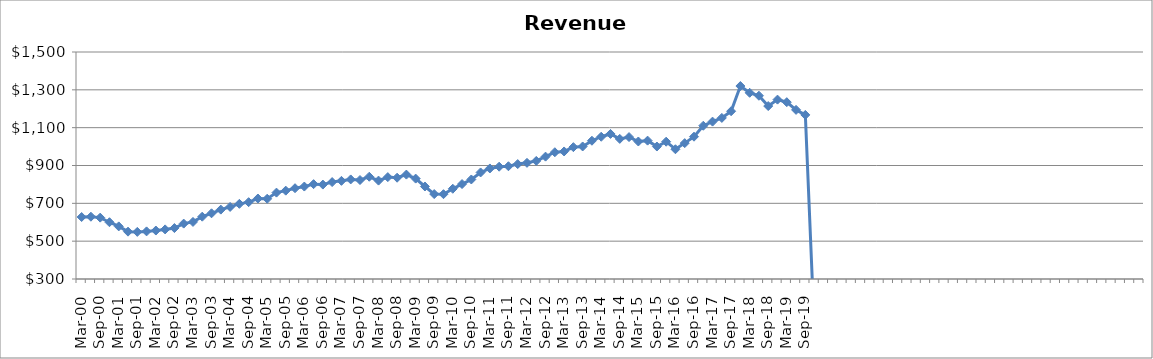
| Category | Revenue ($Millions) |
|---|---|
| Mar-00 | 627.657 |
| Jun-00 | 629.272 |
| Sep-00 | 624.434 |
| Dec-00 | 600.161 |
| Mar-01 | 578.053 |
| Jun-01 | 550.348 |
| Sep-01 | 549.084 |
| Dec-01 | 551.727 |
| Mar-02 | 556.207 |
| Jun-02 | 562.206 |
| Sep-02 | 569.278 |
| Dec-02 | 592.826 |
| Mar-03 | 601.708 |
| Jun-03 | 629.437 |
| Sep-03 | 647.333 |
| Dec-03 | 666.794 |
| Mar-04 | 681.084 |
| Jun-04 | 697.326 |
| Sep-04 | 706.206 |
| Dec-04 | 725.495 |
| Mar-05 | 724.118 |
| Jun-05 | 756.64 |
| Sep-05 | 766.982 |
| Dec-05 | 779.963 |
| Mar-06 | 788.662 |
| Jun-06 | 801.459 |
| Sep-06 | 799.132 |
| Dec-06 | 812.375 |
| Mar-07 | 818.81 |
| Jun-07 | 826.345 |
| Sep-07 | 823.263 |
| Dec-07 | 840.534 |
| Mar-08 | 820.136 |
| Jun-08 | 838.602 |
| Sep-08 | 835.443 |
| Dec-08 | 851.882 |
| Mar-09 | 830.742 |
| Jun-09 | 789.068 |
| Sep-09 | 748.998 |
| Dec-09 | 748.396 |
| Mar-10 | 777.028 |
| Jun-10 | 801.891 |
| Sep-10 | 826.121 |
| Dec-10 | 863.312 |
| Mar-11 | 884.314 |
| Jun-11 | 893.658 |
| Sep-11 | 896.104 |
| Dec-11 | 907.473 |
| Mar-12 | 914.084 |
| Jun-12 | 924.191 |
| Sep-12 | 946.846 |
| Dec-12 | 970.112 |
| Mar-13 | 974.2 |
| Jun-13 | 997.039 |
| Sep-13 | 1000.57 |
| Dec-13 | 1030.964 |
| Mar-14 | 1052.038 |
| Jun-14 | 1066.789 |
| Sep-14 | 1040.618 |
| Dec-14 | 1050.294 |
| Mar-15 | 1026.916 |
| Jun-15 | 1031.45 |
| Sep-15 | 1000.298 |
| Dec-15 | 1025.88 |
| Mar-16 | 985.914 |
| Jun-16 | 1018.278 |
| Sep-16 | 1052.291 |
| Dec-16 | 1110.192 |
| Mar-17 | 1131.964 |
| Jun-17 | 1151.554 |
| Sep-17 | 1186.874 |
| Dec-17 | 1320.152 |
| Mar-18 | 1284.296 |
| Jun-18 | 1268.795 |
| Sep-18 | 1214.238 |
| Dec-18 | 1248.256 |
| Mar-19 | 1234.727 |
| Jun-19 | 1194 |
| Sep-19 | 1167.452 |